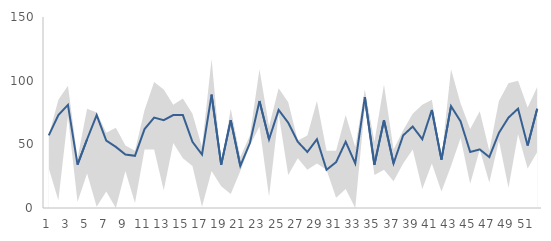
| Category | Average Waiting Time |
|---|---|
| 0 | 57 |
| 1 | 73 |
| 2 | 81 |
| 3 | 34 |
| 4 | 54 |
| 5 | 73 |
| 6 | 53 |
| 7 | 48 |
| 8 | 42 |
| 9 | 41 |
| 10 | 62 |
| 11 | 71 |
| 12 | 69 |
| 13 | 73 |
| 14 | 73 |
| 15 | 52 |
| 16 | 42 |
| 17 | 89 |
| 18 | 34 |
| 19 | 69 |
| 20 | 33 |
| 21 | 51 |
| 22 | 84 |
| 23 | 54 |
| 24 | 77 |
| 25 | 67 |
| 26 | 52 |
| 27 | 44 |
| 28 | 54 |
| 29 | 30 |
| 30 | 36 |
| 31 | 52 |
| 32 | 35 |
| 33 | 87 |
| 34 | 34 |
| 35 | 69 |
| 36 | 35 |
| 37 | 57 |
| 38 | 64 |
| 39 | 54 |
| 40 | 77 |
| 41 | 38 |
| 42 | 80 |
| 43 | 68 |
| 44 | 44 |
| 45 | 46 |
| 46 | 40 |
| 47 | 59 |
| 48 | 71 |
| 49 | 78 |
| 50 | 49 |
| 51 | 78 |